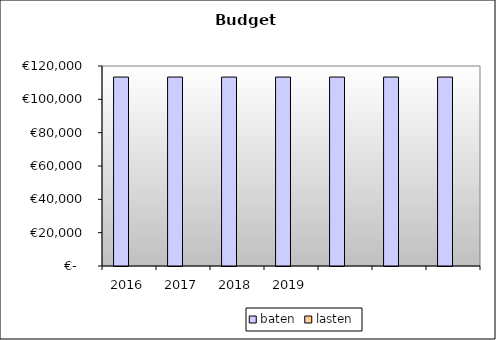
| Category | baten | lasten |
|---|---|---|
| 2016.0 | 113366.05 | 0 |
| 2017.0 | 113366.05 | 0 |
| 2018.0 | 113366.05 | 0 |
| 2019.0 | 113366.05 | 0 |